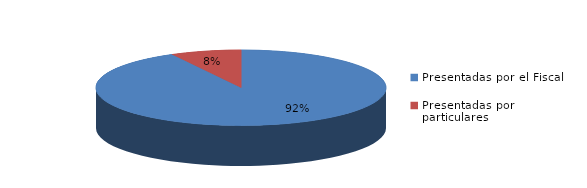
| Category | Series 0 |
|---|---|
| Presentadas por el Fiscal | 397 |
| Presentadas por particulares | 34 |